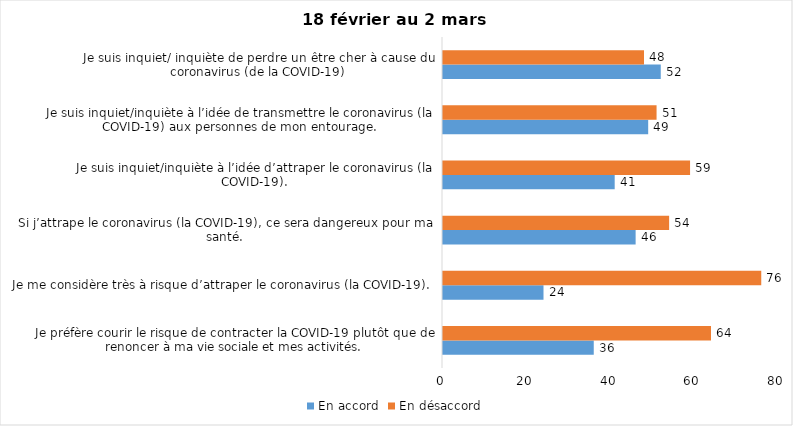
| Category | En accord | En désaccord |
|---|---|---|
| Je préfère courir le risque de contracter la COVID-19 plutôt que de renoncer à ma vie sociale et mes activités. | 36 | 64 |
| Je me considère très à risque d’attraper le coronavirus (la COVID-19). | 24 | 76 |
| Si j’attrape le coronavirus (la COVID-19), ce sera dangereux pour ma santé. | 46 | 54 |
| Je suis inquiet/inquiète à l’idée d’attraper le coronavirus (la COVID-19). | 41 | 59 |
| Je suis inquiet/inquiète à l’idée de transmettre le coronavirus (la COVID-19) aux personnes de mon entourage. | 49 | 51 |
| Je suis inquiet/ inquiète de perdre un être cher à cause du coronavirus (de la COVID-19) | 52 | 48 |